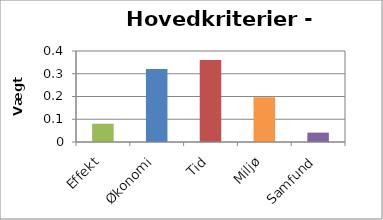
| Category | Vægt 1 |
|---|---|
| Effekt | 0.08 |
| Økonomi | 0.321 |
| Tid | 0.361 |
| Miljø | 0.197 |
| Samfund | 0.041 |